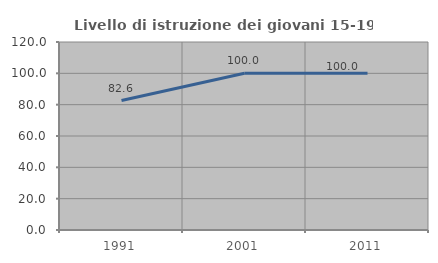
| Category | Livello di istruzione dei giovani 15-19 anni |
|---|---|
| 1991.0 | 82.609 |
| 2001.0 | 100 |
| 2011.0 | 100 |